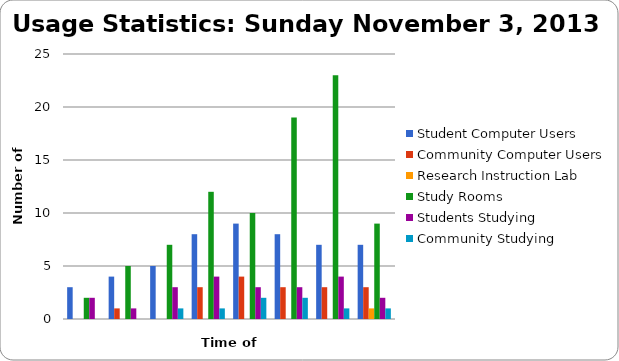
| Category | Student Computer Users | Community Computer Users | Research Instruction Lab | Study Rooms | Students Studying | Community Studying |
|---|---|---|---|---|---|---|
| 10 am | 3 | 0 | 0 | 2 | 2 | 0 |
| 11 am | 4 | 1 | 0 | 5 | 1 | 0 |
| 12 pm | 5 | 0 | 0 | 7 | 3 | 1 |
| 1 pm | 8 | 3 | 0 | 12 | 4 | 1 |
| 2 pm | 9 | 4 | 0 | 10 | 3 | 2 |
| 3 pm | 8 | 3 | 0 | 19 | 3 | 2 |
| 4 pm | 7 | 3 | 0 | 23 | 4 | 1 |
| 5 pm | 7 | 3 | 1 | 9 | 2 | 1 |